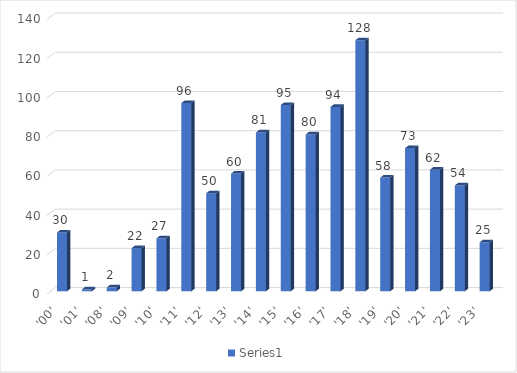
| Category | Series 0 |
|---|---|
| '00' | 30 |
| '01' | 1 |
| '08' | 2 |
| '09' | 22 |
| '10' | 27 |
| '11' | 96 |
| '12' | 50 |
| '13' | 60 |
| '14' | 81 |
| '15' | 95 |
| '16' | 80 |
| '17' | 94 |
| '18' | 128 |
| '19' | 58 |
| '20' | 73 |
| '21' | 62 |
| '22' | 54 |
| '23' | 25 |